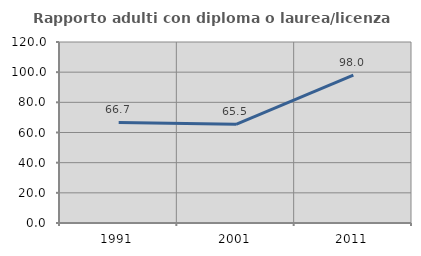
| Category | Rapporto adulti con diploma o laurea/licenza media  |
|---|---|
| 1991.0 | 66.667 |
| 2001.0 | 65.455 |
| 2011.0 | 98 |